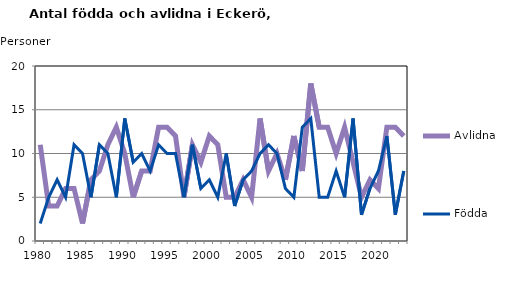
| Category | Avlidna | Födda |
|---|---|---|
| 1980.0 | 11 | 2 |
| 1981.0 | 4 | 5 |
| 1982.0 | 4 | 7 |
| 1983.0 | 6 | 5 |
| 1984.0 | 6 | 11 |
| 1985.0 | 2 | 10 |
| 1986.0 | 7 | 5 |
| 1987.0 | 8 | 11 |
| 1988.0 | 11 | 10 |
| 1989.0 | 13 | 5 |
| 1990.0 | 10 | 14 |
| 1991.0 | 5 | 9 |
| 1992.0 | 8 | 10 |
| 1993.0 | 8 | 8 |
| 1994.0 | 13 | 11 |
| 1995.0 | 13 | 10 |
| 1996.0 | 12 | 10 |
| 1997.0 | 5 | 5 |
| 1998.0 | 11 | 11 |
| 1999.0 | 9 | 6 |
| 2000.0 | 12 | 7 |
| 2001.0 | 11 | 5 |
| 2002.0 | 5 | 10 |
| 2003.0 | 5 | 4 |
| 2004.0 | 7 | 7 |
| 2005.0 | 5 | 8 |
| 2006.0 | 14 | 10 |
| 2007.0 | 8 | 11 |
| 2008.0 | 10 | 10 |
| 2009.0 | 7 | 6 |
| 2010.0 | 12 | 5 |
| 2011.0 | 8 | 13 |
| 2012.0 | 18 | 14 |
| 2013.0 | 13 | 5 |
| 2014.0 | 13 | 5 |
| 2015.0 | 10 | 8 |
| 2016.0 | 13 | 5 |
| 2017.0 | 9 | 14 |
| 2018.0 | 5 | 3 |
| 2019.0 | 7 | 6 |
| 2020.0 | 6 | 8 |
| 2021.0 | 13 | 12 |
| 2022.0 | 13 | 3 |
| 2023.0 | 12 | 8 |